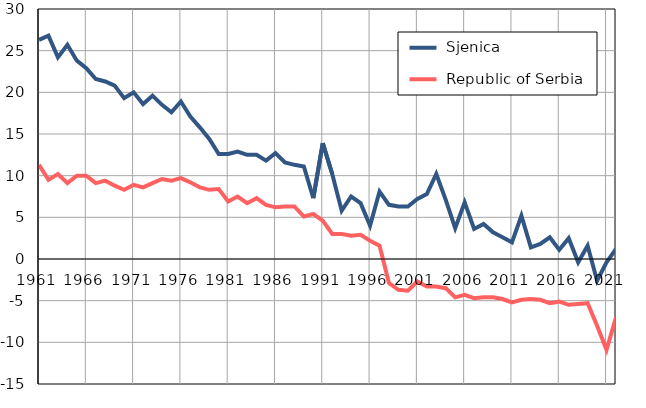
| Category |  Sjenica |  Republic of Serbia |
|---|---|---|
| 1961.0 | 26.3 | 11.3 |
| 1962.0 | 26.8 | 9.5 |
| 1963.0 | 24.2 | 10.2 |
| 1964.0 | 25.7 | 9.1 |
| 1965.0 | 23.8 | 10 |
| 1966.0 | 22.9 | 10 |
| 1967.0 | 21.6 | 9.1 |
| 1968.0 | 21.3 | 9.4 |
| 1969.0 | 20.8 | 8.8 |
| 1970.0 | 19.3 | 8.3 |
| 1971.0 | 20 | 8.9 |
| 1972.0 | 18.6 | 8.6 |
| 1973.0 | 19.6 | 9.1 |
| 1974.0 | 18.5 | 9.6 |
| 1975.0 | 17.6 | 9.4 |
| 1976.0 | 18.9 | 9.7 |
| 1977.0 | 17.1 | 9.2 |
| 1978.0 | 15.8 | 8.6 |
| 1979.0 | 14.4 | 8.3 |
| 1980.0 | 12.6 | 8.4 |
| 1981.0 | 12.6 | 6.9 |
| 1982.0 | 12.9 | 7.5 |
| 1983.0 | 12.5 | 6.7 |
| 1984.0 | 12.5 | 7.3 |
| 1985.0 | 11.8 | 6.5 |
| 1986.0 | 12.7 | 6.2 |
| 1987.0 | 11.6 | 6.3 |
| 1988.0 | 11.3 | 6.3 |
| 1989.0 | 11.1 | 5.1 |
| 1990.0 | 7.3 | 5.4 |
| 1991.0 | 13.9 | 4.6 |
| 1992.0 | 10.2 | 3 |
| 1993.0 | 5.8 | 3 |
| 1994.0 | 7.5 | 2.8 |
| 1995.0 | 6.7 | 2.9 |
| 1996.0 | 4 | 2.2 |
| 1997.0 | 8.1 | 1.6 |
| 1998.0 | 6.5 | -2.9 |
| 1999.0 | 6.3 | -3.7 |
| 2000.0 | 6.3 | -3.8 |
| 2001.0 | 7.2 | -2.7 |
| 2002.0 | 7.8 | -3.3 |
| 2003.0 | 10.2 | -3.3 |
| 2004.0 | 7.1 | -3.5 |
| 2005.0 | 3.7 | -4.6 |
| 2006.0 | 6.8 | -4.3 |
| 2007.0 | 3.6 | -4.7 |
| 2008.0 | 4.2 | -4.6 |
| 2009.0 | 3.2 | -4.6 |
| 2010.0 | 2.6 | -4.8 |
| 2011.0 | 2 | -5.2 |
| 2012.0 | 5.2 | -4.9 |
| 2013.0 | 1.4 | -4.8 |
| 2014.0 | 1.8 | -4.9 |
| 2015.0 | 2.6 | -5.3 |
| 2016.0 | 1.1 | -5.1 |
| 2017.0 | 2.5 | -5.5 |
| 2018.0 | -0.4 | -5.4 |
| 2019.0 | 1.6 | -5.3 |
| 2020.0 | -2.6 | -8 |
| 2021.0 | -0.4 | -10.9 |
| 2022.0 | 1.2 | -7 |